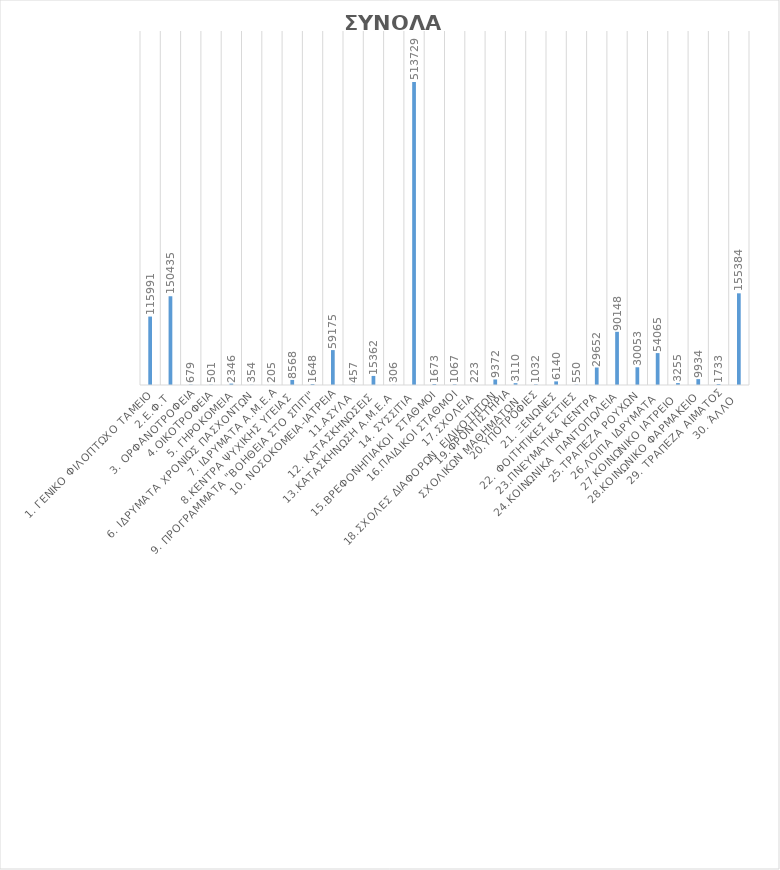
| Category |  ΣΥΝΟΛΑ ΑΤΟΜΩΝ |
|---|---|
| 1. ΓΕΝΙΚΟ ΦΙΛΟΠΤΩΧΟ ΤΑΜΕΙΟ | 115991 |
| 2.Ε.Φ.Τ | 150435 |
| 3. ΟΡΦΑΝΟΤΡΟΦΕΙΑ | 679 |
| 4.ΟΙΚΟΤΡΟΦΕΙΑ | 501 |
| 5. ΓΗΡΟΚΟΜΕΙΑ | 2346 |
| 6. ΙΔΡΥΜΑΤΑ ΧΡΟΝΙΩΣ ΠΑΣΧΟΝΤΩΝ  | 354 |
| 7. ΙΔΡΥΜΑΤΑ Α.Μ.Ε.Α | 205 |
| 8.ΚΕΝΤΡΑ ΨΥΧΙΚΗΣ ΥΓΕΙΑΣ  | 8568 |
| 9. ΠΡΟΓΡΑΜΜΑΤΑ "ΒΟΗΘΕΙΑ ΣΤΟ ΣΠΙΤΙ"  | 1648 |
| 10. ΝΟΣΟΚΟΜΕΙΑ-ΙΑΤΡΕΙΑ | 59175 |
| 11.ΑΣΥΛΑ | 457 |
| 12. ΚΑΤΑΣΚΗΝΩΣΕΙΣ  | 15362 |
| 13.ΚΑΤΑΣΚΗΝΩΣΗ Α.Μ.Ε.Α  | 306 |
| 14. ΣΥΣΣΙΤΙΑ | 513729 |
| 15.ΒΡΕΦΟΝΗΠΙΑΚΟΙ  ΣΤΑΘΜΟΙ | 1673 |
| 16.ΠΑΙΔΙΚΟΙ ΣΤΑΘΜΟΙ | 1067 |
| 17.ΣΧΟΛΕΙΑ | 223 |
| 18.ΣΧΟΛΕΣ ΔΙΑΦΟΡΩΝ  ΕΙΔΙΚΟΤΗΤΩΝ  | 9372 |
| 19.ΦΡΟΝΤΙΣΤΗΡΙΑ
 ΣΧΟΛΙΚΩΝ ΜΑΘΗΜΑΤΩΝ | 3110 |
| 20.ΥΠΟΤΡΟΦΙΕΣ | 1032 |
| 21. ΞΕΝΩΝΕΣ | 6140 |
| 22. ΦΟΙΤΗΤΙΚΕΣ ΕΣΤΙΕΣ  | 550 |
| 23.ΠΝΕΥΜΑΤΙΚΑ ΚΕΝΤΡΑ | 29652 |
| 24.ΚΟΙΝΩΝΙΚΑ  ΠΑΝΤΟΠΩΛΕΙΑ | 90148 |
| 25.ΤΡΑΠΕΖΑ ΡΟΥΧΩΝ | 30053 |
| 26.ΛΟΙΠΑ ΙΔΡΥΜΑΤΑ  | 54065 |
| 27.ΚΟΙΝΩΝΙΚΟ ΙΑΤΡΕΙΟ  | 3255 |
| 28.ΚΟΙΝΩΝΙΚΟ ΦΑΡΜΑΚΕΙΟ | 9934 |
| 29. ΤΡΑΠΕΖΑ ΑΙΜΑΤΟΣ | 1733 |
| 30. ΆΛΛΟ  | 155384 |